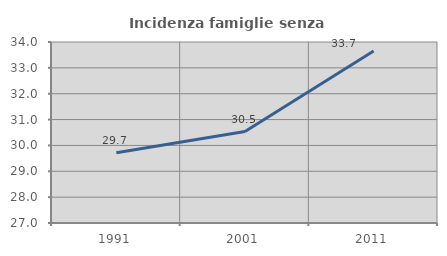
| Category | Incidenza famiglie senza nuclei |
|---|---|
| 1991.0 | 29.719 |
| 2001.0 | 30.536 |
| 2011.0 | 33.654 |